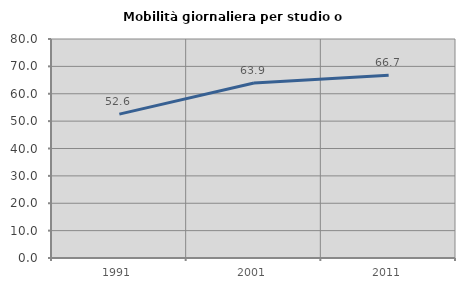
| Category | Mobilità giornaliera per studio o lavoro |
|---|---|
| 1991.0 | 52.571 |
| 2001.0 | 63.924 |
| 2011.0 | 66.716 |